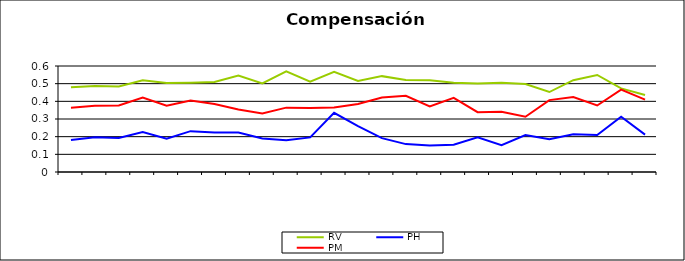
| Category | RV | PH | PM |
|---|---|---|---|
| 0 | 0.479 | 0.181 | 0.364 |
| 1 | 0.487 | 0.196 | 0.375 |
| 2 | 0.484 | 0.192 | 0.376 |
| 3 | 0.52 | 0.226 | 0.421 |
| 4 | 0.504 | 0.189 | 0.375 |
| 5 | 0.506 | 0.231 | 0.404 |
| 6 | 0.51 | 0.224 | 0.384 |
| 7 | 0.546 | 0.223 | 0.353 |
| 8 | 0.501 | 0.19 | 0.331 |
| 9 | 0.57 | 0.18 | 0.364 |
| 10 | 0.511 | 0.196 | 0.363 |
| 11 | 0.567 | 0.335 | 0.365 |
| 12 | 0.515 | 0.26 | 0.385 |
| 13 | 0.543 | 0.192 | 0.422 |
| 14 | 0.52 | 0.158 | 0.431 |
| 15 | 0.519 | 0.15 | 0.371 |
| 16 | 0.505 | 0.154 | 0.42 |
| 17 | 0.501 | 0.196 | 0.339 |
| 18 | 0.506 | 0.151 | 0.341 |
| 19 | 0.498 | 0.209 | 0.313 |
| 20 | 0.453 | 0.186 | 0.407 |
| 21 | 0.52 | 0.213 | 0.424 |
| 22 | 0.549 | 0.21 | 0.376 |
| 23 | 0.473 | 0.312 | 0.466 |
| 24 | 0.436 | 0.212 | 0.41 |